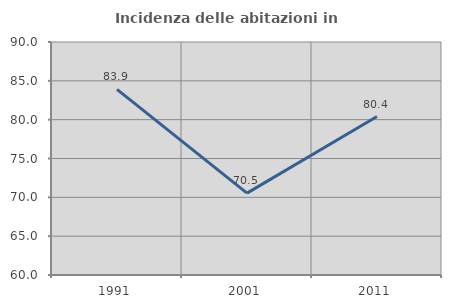
| Category | Incidenza delle abitazioni in proprietà  |
|---|---|
| 1991.0 | 83.908 |
| 2001.0 | 70.54 |
| 2011.0 | 80.402 |